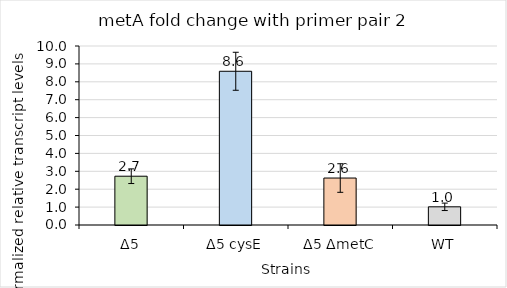
| Category | Series 0 |
|---|---|
| Δ5 | 2.726 |
| Δ5 cysE | 8.588 |
| Δ5 ΔmetC | 2.624 |
| WT | 1.015 |